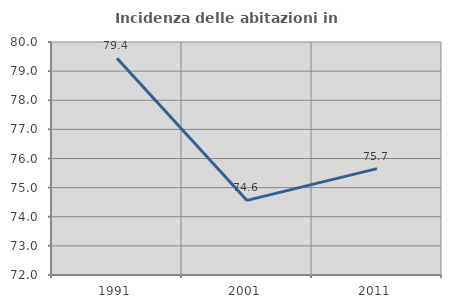
| Category | Incidenza delle abitazioni in proprietà  |
|---|---|
| 1991.0 | 79.439 |
| 2001.0 | 74.561 |
| 2011.0 | 75.652 |